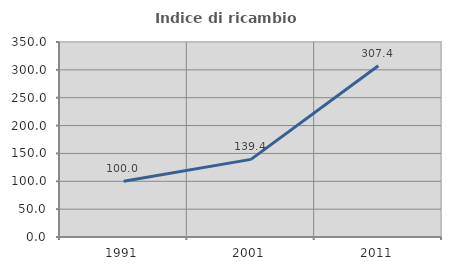
| Category | Indice di ricambio occupazionale  |
|---|---|
| 1991.0 | 100 |
| 2001.0 | 139.362 |
| 2011.0 | 307.432 |